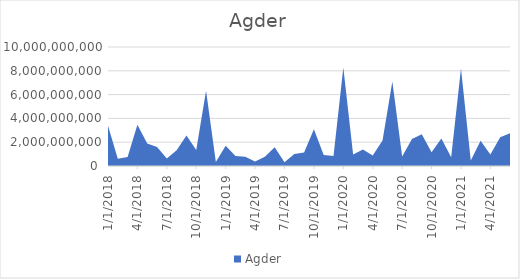
| Category | Agder |
|---|---|
| 1/1/18 | 3379650000 |
| 2/1/18 | 600700000 |
| 3/1/18 | 747375000 |
| 4/1/18 | 3476300000 |
| 5/1/18 | 1900600000 |
| 6/1/18 | 1595550000 |
| 7/1/18 | 620950000 |
| 8/1/18 | 1316940000 |
| 9/1/18 | 2567800000 |
| 10/1/18 | 1345250000 |
| 11/1/18 | 6314150000 |
| 12/1/18 | 332350000 |
| 1/1/19 | 1703750000 |
| 2/1/19 | 848500000 |
| 3/1/19 | 771300000 |
| 4/1/19 | 385900000 |
| 5/1/19 | 778300000 |
| 6/1/19 | 1579450000 |
| 7/1/19 | 324500000 |
| 8/1/19 | 1000300000 |
| 9/1/19 | 1139250000 |
| 10/1/19 | 3097400000 |
| 11/1/19 | 926900000 |
| 12/1/19 | 842400000 |
| 1/1/20 | 8276675000 |
| 2/1/20 | 956250000 |
| 3/1/20 | 1395230000 |
| 4/1/20 | 884000000 |
| 5/1/20 | 2149150000 |
| 6/1/20 | 7108300000 |
| 7/1/20 | 794600000 |
| 8/1/20 | 2259250000 |
| 9/1/20 | 2677200000 |
| 10/1/20 | 1156300000 |
| 11/1/20 | 2310000000 |
| 12/1/20 | 724900000 |
| 1/1/21 | 8190500000 |
| 2/1/21 | 451810000 |
| 3/1/21 | 2124800000 |
| 4/1/21 | 974350000 |
| 5/1/21 | 2421150000 |
| 6/1/21 | 2755000000 |